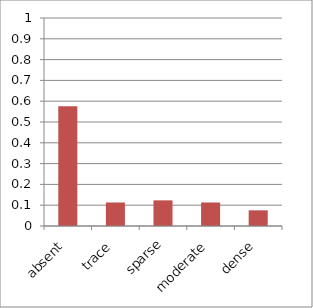
| Category | Cab car |
|---|---|
| absent | 0.575 |
| trace | 0.113 |
| sparse | 0.123 |
| moderate | 0.113 |
| dense | 0.075 |